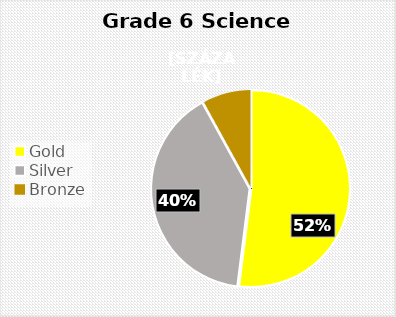
| Category | Series 0 |
|---|---|
| Gold | 13 |
| Silver | 10 |
| Bronze  | 2 |